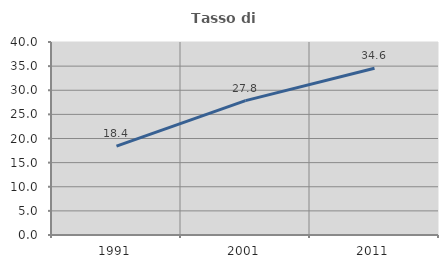
| Category | Tasso di occupazione   |
|---|---|
| 1991.0 | 18.409 |
| 2001.0 | 27.841 |
| 2011.0 | 34.564 |